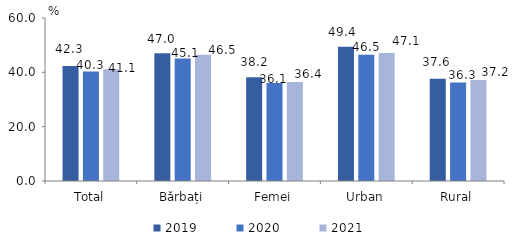
| Category | 2019 | 2020 | 2021 |
|---|---|---|---|
| Total | 42.3 | 40.3 | 41.1 |
| Bărbați | 47 | 45.1 | 46.5 |
| Femei | 38.2 | 36.1 | 36.4 |
| Urban | 49.4 | 46.5 | 47.1 |
| Rural | 37.6 | 36.3 | 37.2 |